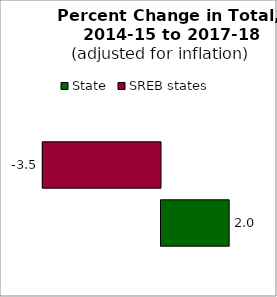
| Category | State | SREB states |
|---|---|---|
| 0 | 2.005 | -3.475 |